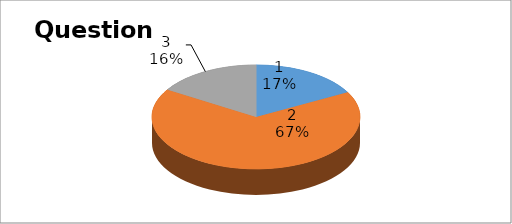
| Category | Series 0 |
|---|---|
| 0 | 36 |
| 1 | 140 |
| 2 | 34 |